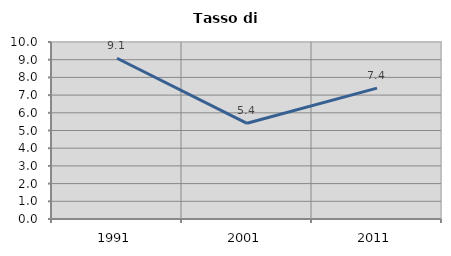
| Category | Tasso di disoccupazione   |
|---|---|
| 1991.0 | 9.081 |
| 2001.0 | 5.407 |
| 2011.0 | 7.392 |